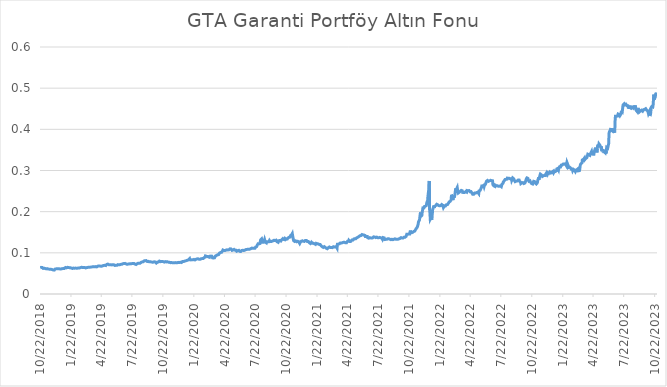
| Category | Fiyat |
|---|---|
| 10/22/18 | 0.064 |
| 10/23/18 | 0.064 |
| 10/24/18 | 0.066 |
| 10/25/18 | 0.065 |
| 10/26/18 | 0.064 |
| 10/27/18 | 0.064 |
| 10/28/18 | 0.064 |
| 10/29/18 | 0.064 |
| 10/30/18 | 0.064 |
| 10/31/18 | 0.062 |
| 11/1/18 | 0.062 |
| 11/2/18 | 0.063 |
| 11/3/18 | 0.063 |
| 11/4/18 | 0.063 |
| 11/5/18 | 0.062 |
| 11/6/18 | 0.062 |
| 11/7/18 | 0.061 |
| 11/8/18 | 0.061 |
| 11/9/18 | 0.061 |
| 11/10/18 | 0.061 |
| 11/11/18 | 0.061 |
| 11/12/18 | 0.062 |
| 11/13/18 | 0.061 |
| 11/14/18 | 0.061 |
| 11/15/18 | 0.06 |
| 11/16/18 | 0.06 |
| 11/17/18 | 0.06 |
| 11/18/18 | 0.06 |
| 11/19/18 | 0.06 |
| 11/20/18 | 0.06 |
| 11/21/18 | 0.06 |
| 11/22/18 | 0.06 |
| 11/23/18 | 0.06 |
| 11/24/18 | 0.06 |
| 11/25/18 | 0.06 |
| 11/26/18 | 0.06 |
| 11/27/18 | 0.059 |
| 11/28/18 | 0.059 |
| 11/29/18 | 0.059 |
| 11/30/18 | 0.058 |
| 12/1/18 | 0.058 |
| 12/2/18 | 0.058 |
| 12/3/18 | 0.058 |
| 12/4/18 | 0.058 |
| 12/5/18 | 0.06 |
| 12/6/18 | 0.061 |
| 12/7/18 | 0.061 |
| 12/8/18 | 0.061 |
| 12/9/18 | 0.061 |
| 12/10/18 | 0.061 |
| 12/11/18 | 0.06 |
| 12/12/18 | 0.061 |
| 12/13/18 | 0.061 |
| 12/14/18 | 0.061 |
| 12/15/18 | 0.061 |
| 12/16/18 | 0.061 |
| 12/17/18 | 0.061 |
| 12/18/18 | 0.061 |
| 12/19/18 | 0.061 |
| 12/20/18 | 0.061 |
| 12/21/18 | 0.061 |
| 12/22/18 | 0.061 |
| 12/23/18 | 0.061 |
| 12/24/18 | 0.061 |
| 12/25/18 | 0.061 |
| 12/26/18 | 0.062 |
| 12/27/18 | 0.062 |
| 12/28/18 | 0.062 |
| 12/29/18 | 0.062 |
| 12/30/18 | 0.062 |
| 12/31/18 | 0.062 |
| 1/1/19 | 0.062 |
| 1/2/19 | 0.062 |
| 1/3/19 | 0.063 |
| 1/4/19 | 0.064 |
| 1/5/19 | 0.064 |
| 1/6/19 | 0.064 |
| 1/7/19 | 0.064 |
| 1/8/19 | 0.064 |
| 1/9/19 | 0.064 |
| 1/10/19 | 0.065 |
| 1/11/19 | 0.065 |
| 1/12/19 | 0.065 |
| 1/13/19 | 0.065 |
| 1/14/19 | 0.064 |
| 1/15/19 | 0.065 |
| 1/16/19 | 0.064 |
| 1/17/19 | 0.064 |
| 1/18/19 | 0.064 |
| 1/19/19 | 0.064 |
| 1/20/19 | 0.064 |
| 1/21/19 | 0.063 |
| 1/22/19 | 0.063 |
| 1/23/19 | 0.063 |
| 1/24/19 | 0.063 |
| 1/25/19 | 0.062 |
| 1/26/19 | 0.062 |
| 1/27/19 | 0.062 |
| 1/28/19 | 0.062 |
| 1/29/19 | 0.063 |
| 1/30/19 | 0.064 |
| 1/31/19 | 0.064 |
| 2/1/19 | 0.063 |
| 2/2/19 | 0.063 |
| 2/3/19 | 0.063 |
| 2/4/19 | 0.063 |
| 2/5/19 | 0.063 |
| 2/6/19 | 0.063 |
| 2/7/19 | 0.063 |
| 2/8/19 | 0.063 |
| 2/9/19 | 0.063 |
| 2/10/19 | 0.063 |
| 2/11/19 | 0.063 |
| 2/12/19 | 0.063 |
| 2/13/19 | 0.063 |
| 2/14/19 | 0.063 |
| 2/15/19 | 0.063 |
| 2/16/19 | 0.063 |
| 2/17/19 | 0.063 |
| 2/18/19 | 0.064 |
| 2/19/19 | 0.064 |
| 2/20/19 | 0.065 |
| 2/21/19 | 0.065 |
| 2/22/19 | 0.065 |
| 2/23/19 | 0.065 |
| 2/24/19 | 0.065 |
| 2/25/19 | 0.064 |
| 2/26/19 | 0.065 |
| 2/27/19 | 0.064 |
| 2/28/19 | 0.064 |
| 3/1/19 | 0.064 |
| 3/2/19 | 0.064 |
| 3/3/19 | 0.064 |
| 3/4/19 | 0.064 |
| 3/5/19 | 0.064 |
| 3/6/19 | 0.063 |
| 3/7/19 | 0.064 |
| 3/8/19 | 0.064 |
| 3/9/19 | 0.064 |
| 3/10/19 | 0.064 |
| 3/11/19 | 0.065 |
| 3/12/19 | 0.065 |
| 3/13/19 | 0.065 |
| 3/14/19 | 0.065 |
| 3/15/19 | 0.065 |
| 3/16/19 | 0.065 |
| 3/17/19 | 0.065 |
| 3/18/19 | 0.065 |
| 3/19/19 | 0.065 |
| 3/20/19 | 0.066 |
| 3/21/19 | 0.065 |
| 3/22/19 | 0.066 |
| 3/23/19 | 0.066 |
| 3/24/19 | 0.066 |
| 3/25/19 | 0.066 |
| 3/26/19 | 0.068 |
| 3/27/19 | 0.066 |
| 3/28/19 | 0.064 |
| 3/29/19 | 0.066 |
| 3/30/19 | 0.066 |
| 3/31/19 | 0.066 |
| 4/1/19 | 0.066 |
| 4/2/19 | 0.066 |
| 4/3/19 | 0.066 |
| 4/4/19 | 0.066 |
| 4/5/19 | 0.066 |
| 4/6/19 | 0.066 |
| 4/7/19 | 0.066 |
| 4/8/19 | 0.066 |
| 4/9/19 | 0.067 |
| 4/10/19 | 0.067 |
| 4/11/19 | 0.068 |
| 4/12/19 | 0.068 |
| 4/13/19 | 0.068 |
| 4/14/19 | 0.068 |
| 4/15/19 | 0.068 |
| 4/16/19 | 0.068 |
| 4/17/19 | 0.068 |
| 4/18/19 | 0.067 |
| 4/19/19 | 0.068 |
| 4/20/19 | 0.068 |
| 4/21/19 | 0.068 |
| 4/22/19 | 0.068 |
| 4/23/19 | 0.068 |
| 4/24/19 | 0.068 |
| 4/25/19 | 0.068 |
| 4/26/19 | 0.069 |
| 4/27/19 | 0.069 |
| 4/28/19 | 0.069 |
| 4/29/19 | 0.069 |
| 4/30/19 | 0.069 |
| 5/1/19 | 0.069 |
| 5/2/19 | 0.07 |
| 5/3/19 | 0.069 |
| 5/4/19 | 0.069 |
| 5/5/19 | 0.069 |
| 5/6/19 | 0.069 |
| 5/7/19 | 0.07 |
| 5/8/19 | 0.072 |
| 5/9/19 | 0.072 |
| 5/10/19 | 0.073 |
| 5/11/19 | 0.073 |
| 5/12/19 | 0.073 |
| 5/13/19 | 0.072 |
| 5/14/19 | 0.071 |
| 5/15/19 | 0.071 |
| 5/16/19 | 0.072 |
| 5/17/19 | 0.071 |
| 5/18/19 | 0.071 |
| 5/19/19 | 0.071 |
| 5/20/19 | 0.071 |
| 5/21/19 | 0.07 |
| 5/22/19 | 0.07 |
| 5/23/19 | 0.071 |
| 5/24/19 | 0.071 |
| 5/25/19 | 0.071 |
| 5/26/19 | 0.071 |
| 5/27/19 | 0.071 |
| 5/28/19 | 0.071 |
| 5/29/19 | 0.071 |
| 5/30/19 | 0.071 |
| 5/31/19 | 0.069 |
| 6/1/19 | 0.069 |
| 6/2/19 | 0.069 |
| 6/3/19 | 0.07 |
| 6/4/19 | 0.07 |
| 6/5/19 | 0.07 |
| 6/6/19 | 0.07 |
| 6/7/19 | 0.07 |
| 6/8/19 | 0.07 |
| 6/9/19 | 0.07 |
| 6/10/19 | 0.071 |
| 6/11/19 | 0.07 |
| 6/12/19 | 0.07 |
| 6/13/19 | 0.071 |
| 6/14/19 | 0.071 |
| 6/15/19 | 0.071 |
| 6/16/19 | 0.071 |
| 6/17/19 | 0.073 |
| 6/18/19 | 0.072 |
| 6/19/19 | 0.072 |
| 6/20/19 | 0.072 |
| 6/21/19 | 0.072 |
| 6/22/19 | 0.072 |
| 6/23/19 | 0.072 |
| 6/24/19 | 0.074 |
| 6/25/19 | 0.074 |
| 6/26/19 | 0.075 |
| 6/27/19 | 0.074 |
| 6/28/19 | 0.074 |
| 6/29/19 | 0.074 |
| 6/30/19 | 0.074 |
| 7/1/19 | 0.074 |
| 7/2/19 | 0.072 |
| 7/3/19 | 0.072 |
| 7/4/19 | 0.073 |
| 7/5/19 | 0.072 |
| 7/6/19 | 0.072 |
| 7/7/19 | 0.072 |
| 7/8/19 | 0.072 |
| 7/9/19 | 0.073 |
| 7/10/19 | 0.073 |
| 7/11/19 | 0.073 |
| 7/12/19 | 0.073 |
| 7/13/19 | 0.073 |
| 7/14/19 | 0.073 |
| 7/15/19 | 0.073 |
| 7/16/19 | 0.073 |
| 7/17/19 | 0.074 |
| 7/18/19 | 0.073 |
| 7/19/19 | 0.074 |
| 7/20/19 | 0.074 |
| 7/21/19 | 0.074 |
| 7/22/19 | 0.074 |
| 7/23/19 | 0.074 |
| 7/24/19 | 0.074 |
| 7/25/19 | 0.074 |
| 7/26/19 | 0.074 |
| 7/27/19 | 0.074 |
| 7/28/19 | 0.074 |
| 7/29/19 | 0.073 |
| 7/30/19 | 0.073 |
| 7/31/19 | 0.072 |
| 8/1/19 | 0.072 |
| 8/2/19 | 0.072 |
| 8/3/19 | 0.072 |
| 8/4/19 | 0.072 |
| 8/5/19 | 0.073 |
| 8/6/19 | 0.074 |
| 8/7/19 | 0.074 |
| 8/8/19 | 0.074 |
| 8/9/19 | 0.075 |
| 8/10/19 | 0.075 |
| 8/11/19 | 0.075 |
| 8/12/19 | 0.075 |
| 8/13/19 | 0.075 |
| 8/14/19 | 0.075 |
| 8/15/19 | 0.075 |
| 8/16/19 | 0.077 |
| 8/17/19 | 0.077 |
| 8/18/19 | 0.077 |
| 8/19/19 | 0.076 |
| 8/20/19 | 0.076 |
| 8/21/19 | 0.078 |
| 8/22/19 | 0.078 |
| 8/23/19 | 0.078 |
| 8/24/19 | 0.078 |
| 8/25/19 | 0.078 |
| 8/26/19 | 0.078 |
| 8/27/19 | 0.08 |
| 8/28/19 | 0.081 |
| 8/29/19 | 0.081 |
| 8/30/19 | 0.081 |
| 8/31/19 | 0.081 |
| 9/1/19 | 0.081 |
| 9/2/19 | 0.081 |
| 9/3/19 | 0.08 |
| 9/4/19 | 0.08 |
| 9/5/19 | 0.079 |
| 9/6/19 | 0.079 |
| 9/7/19 | 0.079 |
| 9/8/19 | 0.079 |
| 9/9/19 | 0.078 |
| 9/10/19 | 0.078 |
| 9/11/19 | 0.078 |
| 9/12/19 | 0.078 |
| 9/13/19 | 0.078 |
| 9/14/19 | 0.078 |
| 9/15/19 | 0.078 |
| 9/16/19 | 0.077 |
| 9/17/19 | 0.078 |
| 9/18/19 | 0.078 |
| 9/19/19 | 0.077 |
| 9/20/19 | 0.077 |
| 9/21/19 | 0.077 |
| 9/22/19 | 0.077 |
| 9/23/19 | 0.077 |
| 9/24/19 | 0.079 |
| 9/25/19 | 0.078 |
| 9/26/19 | 0.078 |
| 9/27/19 | 0.078 |
| 9/28/19 | 0.078 |
| 9/29/19 | 0.078 |
| 9/30/19 | 0.077 |
| 10/1/19 | 0.076 |
| 10/2/19 | 0.075 |
| 10/3/19 | 0.077 |
| 10/4/19 | 0.077 |
| 10/5/19 | 0.077 |
| 10/6/19 | 0.077 |
| 10/7/19 | 0.078 |
| 10/8/19 | 0.078 |
| 10/9/19 | 0.079 |
| 10/10/19 | 0.08 |
| 10/11/19 | 0.08 |
| 10/12/19 | 0.08 |
| 10/13/19 | 0.08 |
| 10/14/19 | 0.078 |
| 10/15/19 | 0.08 |
| 10/16/19 | 0.08 |
| 10/17/19 | 0.079 |
| 10/18/19 | 0.079 |
| 10/19/19 | 0.079 |
| 10/20/19 | 0.079 |
| 10/21/19 | 0.078 |
| 10/22/19 | 0.078 |
| 10/23/19 | 0.078 |
| 10/24/19 | 0.078 |
| 10/25/19 | 0.078 |
| 10/26/19 | 0.078 |
| 10/27/19 | 0.078 |
| 10/28/19 | 0.079 |
| 10/29/19 | 0.079 |
| 10/30/19 | 0.079 |
| 10/31/19 | 0.077 |
| 11/1/19 | 0.078 |
| 11/2/19 | 0.078 |
| 11/3/19 | 0.078 |
| 11/4/19 | 0.078 |
| 11/5/19 | 0.078 |
| 11/6/19 | 0.078 |
| 11/7/19 | 0.077 |
| 11/8/19 | 0.077 |
| 11/9/19 | 0.077 |
| 11/10/19 | 0.077 |
| 11/11/19 | 0.077 |
| 11/12/19 | 0.077 |
| 11/13/19 | 0.076 |
| 11/14/19 | 0.077 |
| 11/15/19 | 0.076 |
| 11/16/19 | 0.076 |
| 11/17/19 | 0.076 |
| 11/18/19 | 0.076 |
| 11/19/19 | 0.076 |
| 11/20/19 | 0.076 |
| 11/21/19 | 0.076 |
| 11/22/19 | 0.076 |
| 11/23/19 | 0.076 |
| 11/24/19 | 0.076 |
| 11/25/19 | 0.076 |
| 11/26/19 | 0.076 |
| 11/27/19 | 0.076 |
| 11/28/19 | 0.076 |
| 11/29/19 | 0.076 |
| 11/30/19 | 0.076 |
| 12/1/19 | 0.076 |
| 12/2/19 | 0.076 |
| 12/3/19 | 0.076 |
| 12/4/19 | 0.076 |
| 12/5/19 | 0.077 |
| 12/6/19 | 0.077 |
| 12/7/19 | 0.077 |
| 12/8/19 | 0.077 |
| 12/9/19 | 0.077 |
| 12/10/19 | 0.076 |
| 12/11/19 | 0.077 |
| 12/12/19 | 0.077 |
| 12/13/19 | 0.077 |
| 12/14/19 | 0.077 |
| 12/15/19 | 0.077 |
| 12/16/19 | 0.076 |
| 12/17/19 | 0.078 |
| 12/18/19 | 0.078 |
| 12/19/19 | 0.079 |
| 12/20/19 | 0.079 |
| 12/21/19 | 0.079 |
| 12/22/19 | 0.079 |
| 12/23/19 | 0.08 |
| 12/24/19 | 0.08 |
| 12/25/19 | 0.08 |
| 12/26/19 | 0.079 |
| 12/27/19 | 0.08 |
| 12/28/19 | 0.08 |
| 12/29/19 | 0.08 |
| 12/30/19 | 0.08 |
| 12/31/19 | 0.081 |
| 1/1/20 | 0.081 |
| 1/2/20 | 0.081 |
| 1/3/20 | 0.082 |
| 1/4/20 | 0.082 |
| 1/5/20 | 0.082 |
| 1/6/20 | 0.083 |
| 1/7/20 | 0.085 |
| 1/8/20 | 0.085 |
| 1/9/20 | 0.086 |
| 1/10/20 | 0.083 |
| 1/11/20 | 0.083 |
| 1/12/20 | 0.083 |
| 1/13/20 | 0.083 |
| 1/14/20 | 0.083 |
| 1/15/20 | 0.083 |
| 1/16/20 | 0.083 |
| 1/17/20 | 0.083 |
| 1/18/20 | 0.083 |
| 1/19/20 | 0.083 |
| 1/20/20 | 0.083 |
| 1/21/20 | 0.083 |
| 1/22/20 | 0.084 |
| 1/23/20 | 0.084 |
| 1/24/20 | 0.083 |
| 1/25/20 | 0.083 |
| 1/26/20 | 0.083 |
| 1/27/20 | 0.084 |
| 1/28/20 | 0.084 |
| 1/29/20 | 0.085 |
| 1/30/20 | 0.084 |
| 1/31/20 | 0.085 |
| 2/1/20 | 0.085 |
| 2/2/20 | 0.085 |
| 2/3/20 | 0.085 |
| 2/4/20 | 0.085 |
| 2/5/20 | 0.085 |
| 2/6/20 | 0.084 |
| 2/7/20 | 0.084 |
| 2/8/20 | 0.084 |
| 2/9/20 | 0.084 |
| 2/10/20 | 0.085 |
| 2/11/20 | 0.085 |
| 2/12/20 | 0.086 |
| 2/13/20 | 0.086 |
| 2/14/20 | 0.086 |
| 2/15/20 | 0.086 |
| 2/16/20 | 0.086 |
| 2/17/20 | 0.086 |
| 2/18/20 | 0.086 |
| 2/19/20 | 0.087 |
| 2/20/20 | 0.088 |
| 2/21/20 | 0.088 |
| 2/22/20 | 0.088 |
| 2/23/20 | 0.088 |
| 2/24/20 | 0.089 |
| 2/25/20 | 0.092 |
| 2/26/20 | 0.091 |
| 2/27/20 | 0.091 |
| 2/28/20 | 0.092 |
| 2/29/20 | 0.092 |
| 3/1/20 | 0.092 |
| 3/2/20 | 0.091 |
| 3/3/20 | 0.09 |
| 3/4/20 | 0.089 |
| 3/5/20 | 0.09 |
| 3/6/20 | 0.089 |
| 3/7/20 | 0.089 |
| 3/8/20 | 0.089 |
| 3/9/20 | 0.092 |
| 3/10/20 | 0.092 |
| 3/11/20 | 0.092 |
| 3/12/20 | 0.092 |
| 3/13/20 | 0.092 |
| 3/14/20 | 0.092 |
| 3/15/20 | 0.092 |
| 3/16/20 | 0.09 |
| 3/17/20 | 0.088 |
| 3/18/20 | 0.087 |
| 3/19/20 | 0.088 |
| 3/20/20 | 0.088 |
| 3/21/20 | 0.088 |
| 3/22/20 | 0.088 |
| 3/23/20 | 0.088 |
| 3/24/20 | 0.089 |
| 3/25/20 | 0.09 |
| 3/26/20 | 0.092 |
| 3/27/20 | 0.094 |
| 3/28/20 | 0.094 |
| 3/29/20 | 0.094 |
| 3/30/20 | 0.094 |
| 3/31/20 | 0.095 |
| 4/1/20 | 0.095 |
| 4/2/20 | 0.096 |
| 4/3/20 | 0.096 |
| 4/4/20 | 0.096 |
| 4/5/20 | 0.096 |
| 4/6/20 | 0.097 |
| 4/7/20 | 0.1 |
| 4/8/20 | 0.1 |
| 4/9/20 | 0.101 |
| 4/10/20 | 0.101 |
| 4/11/20 | 0.101 |
| 4/12/20 | 0.101 |
| 4/13/20 | 0.101 |
| 4/14/20 | 0.103 |
| 4/15/20 | 0.104 |
| 4/16/20 | 0.104 |
| 4/17/20 | 0.107 |
| 4/18/20 | 0.107 |
| 4/19/20 | 0.107 |
| 4/20/20 | 0.105 |
| 4/21/20 | 0.104 |
| 4/22/20 | 0.106 |
| 4/23/20 | 0.106 |
| 4/24/20 | 0.107 |
| 4/25/20 | 0.107 |
| 4/26/20 | 0.107 |
| 4/27/20 | 0.108 |
| 4/28/20 | 0.108 |
| 4/29/20 | 0.107 |
| 4/30/20 | 0.107 |
| 5/1/20 | 0.107 |
| 5/2/20 | 0.107 |
| 5/3/20 | 0.107 |
| 5/4/20 | 0.108 |
| 5/5/20 | 0.108 |
| 5/6/20 | 0.108 |
| 5/7/20 | 0.109 |
| 5/8/20 | 0.11 |
| 5/9/20 | 0.11 |
| 5/10/20 | 0.11 |
| 5/11/20 | 0.11 |
| 5/12/20 | 0.108 |
| 5/13/20 | 0.107 |
| 5/14/20 | 0.106 |
| 5/15/20 | 0.107 |
| 5/16/20 | 0.107 |
| 5/17/20 | 0.107 |
| 5/18/20 | 0.107 |
| 5/19/20 | 0.107 |
| 5/20/20 | 0.108 |
| 5/21/20 | 0.106 |
| 5/22/20 | 0.106 |
| 5/23/20 | 0.106 |
| 5/24/20 | 0.106 |
| 5/25/20 | 0.106 |
| 5/26/20 | 0.106 |
| 5/27/20 | 0.106 |
| 5/28/20 | 0.104 |
| 5/29/20 | 0.105 |
| 5/30/20 | 0.105 |
| 5/31/20 | 0.105 |
| 6/1/20 | 0.106 |
| 6/2/20 | 0.106 |
| 6/3/20 | 0.106 |
| 6/4/20 | 0.104 |
| 6/5/20 | 0.104 |
| 6/6/20 | 0.104 |
| 6/7/20 | 0.104 |
| 6/8/20 | 0.104 |
| 6/9/20 | 0.103 |
| 6/10/20 | 0.104 |
| 6/11/20 | 0.105 |
| 6/12/20 | 0.106 |
| 6/13/20 | 0.106 |
| 6/14/20 | 0.106 |
| 6/15/20 | 0.106 |
| 6/16/20 | 0.105 |
| 6/17/20 | 0.106 |
| 6/18/20 | 0.106 |
| 6/19/20 | 0.106 |
| 6/20/20 | 0.106 |
| 6/21/20 | 0.106 |
| 6/22/20 | 0.106 |
| 6/23/20 | 0.107 |
| 6/24/20 | 0.108 |
| 6/25/20 | 0.109 |
| 6/26/20 | 0.108 |
| 6/27/20 | 0.108 |
| 6/28/20 | 0.108 |
| 6/29/20 | 0.108 |
| 6/30/20 | 0.109 |
| 7/1/20 | 0.109 |
| 7/2/20 | 0.11 |
| 7/3/20 | 0.109 |
| 7/4/20 | 0.109 |
| 7/5/20 | 0.109 |
| 7/6/20 | 0.109 |
| 7/7/20 | 0.109 |
| 7/8/20 | 0.11 |
| 7/9/20 | 0.11 |
| 7/10/20 | 0.112 |
| 7/11/20 | 0.112 |
| 7/12/20 | 0.112 |
| 7/13/20 | 0.111 |
| 7/14/20 | 0.111 |
| 7/15/20 | 0.111 |
| 7/16/20 | 0.111 |
| 7/17/20 | 0.111 |
| 7/18/20 | 0.111 |
| 7/19/20 | 0.111 |
| 7/20/20 | 0.111 |
| 7/21/20 | 0.111 |
| 7/22/20 | 0.112 |
| 7/23/20 | 0.114 |
| 7/24/20 | 0.115 |
| 7/25/20 | 0.115 |
| 7/26/20 | 0.115 |
| 7/27/20 | 0.116 |
| 7/28/20 | 0.119 |
| 7/29/20 | 0.119 |
| 7/30/20 | 0.122 |
| 7/31/20 | 0.122 |
| 8/1/20 | 0.122 |
| 8/2/20 | 0.122 |
| 8/3/20 | 0.122 |
| 8/4/20 | 0.122 |
| 8/5/20 | 0.123 |
| 8/6/20 | 0.127 |
| 8/7/20 | 0.131 |
| 8/8/20 | 0.131 |
| 8/9/20 | 0.131 |
| 8/10/20 | 0.134 |
| 8/11/20 | 0.134 |
| 8/12/20 | 0.134 |
| 8/13/20 | 0.126 |
| 8/14/20 | 0.126 |
| 8/15/20 | 0.126 |
| 8/16/20 | 0.126 |
| 8/17/20 | 0.128 |
| 8/18/20 | 0.128 |
| 8/19/20 | 0.132 |
| 8/20/20 | 0.131 |
| 8/21/20 | 0.126 |
| 8/22/20 | 0.126 |
| 8/23/20 | 0.126 |
| 8/24/20 | 0.124 |
| 8/25/20 | 0.127 |
| 8/26/20 | 0.127 |
| 8/27/20 | 0.125 |
| 8/28/20 | 0.126 |
| 8/29/20 | 0.126 |
| 8/30/20 | 0.126 |
| 8/31/20 | 0.127 |
| 9/1/20 | 0.128 |
| 9/2/20 | 0.13 |
| 9/3/20 | 0.129 |
| 9/4/20 | 0.127 |
| 9/5/20 | 0.127 |
| 9/6/20 | 0.127 |
| 9/7/20 | 0.127 |
| 9/8/20 | 0.128 |
| 9/9/20 | 0.128 |
| 9/10/20 | 0.128 |
| 9/11/20 | 0.129 |
| 9/12/20 | 0.129 |
| 9/13/20 | 0.129 |
| 9/14/20 | 0.129 |
| 9/15/20 | 0.129 |
| 9/16/20 | 0.13 |
| 9/17/20 | 0.131 |
| 9/18/20 | 0.13 |
| 9/19/20 | 0.13 |
| 9/20/20 | 0.13 |
| 9/21/20 | 0.13 |
| 9/22/20 | 0.131 |
| 9/23/20 | 0.129 |
| 9/24/20 | 0.128 |
| 9/25/20 | 0.127 |
| 9/26/20 | 0.127 |
| 9/27/20 | 0.127 |
| 9/28/20 | 0.126 |
| 9/29/20 | 0.128 |
| 9/30/20 | 0.13 |
| 10/1/20 | 0.13 |
| 10/2/20 | 0.13 |
| 10/3/20 | 0.13 |
| 10/4/20 | 0.13 |
| 10/5/20 | 0.129 |
| 10/6/20 | 0.129 |
| 10/7/20 | 0.131 |
| 10/8/20 | 0.13 |
| 10/9/20 | 0.132 |
| 10/10/20 | 0.132 |
| 10/11/20 | 0.132 |
| 10/12/20 | 0.135 |
| 10/13/20 | 0.134 |
| 10/14/20 | 0.134 |
| 10/15/20 | 0.132 |
| 10/16/20 | 0.132 |
| 10/17/20 | 0.132 |
| 10/18/20 | 0.132 |
| 10/19/20 | 0.135 |
| 10/20/20 | 0.134 |
| 10/21/20 | 0.133 |
| 10/22/20 | 0.133 |
| 10/23/20 | 0.134 |
| 10/24/20 | 0.134 |
| 10/25/20 | 0.134 |
| 10/26/20 | 0.135 |
| 10/27/20 | 0.136 |
| 10/28/20 | 0.138 |
| 10/29/20 | 0.138 |
| 10/30/20 | 0.138 |
| 10/31/20 | 0.138 |
| 11/1/20 | 0.138 |
| 11/2/20 | 0.138 |
| 11/3/20 | 0.14 |
| 11/4/20 | 0.142 |
| 11/5/20 | 0.142 |
| 11/6/20 | 0.144 |
| 11/7/20 | 0.144 |
| 11/8/20 | 0.144 |
| 11/9/20 | 0.147 |
| 11/10/20 | 0.142 |
| 11/11/20 | 0.138 |
| 11/12/20 | 0.133 |
| 11/13/20 | 0.13 |
| 11/14/20 | 0.13 |
| 11/15/20 | 0.13 |
| 11/16/20 | 0.128 |
| 11/17/20 | 0.129 |
| 11/18/20 | 0.13 |
| 11/19/20 | 0.129 |
| 11/20/20 | 0.127 |
| 11/21/20 | 0.127 |
| 11/22/20 | 0.127 |
| 11/23/20 | 0.126 |
| 11/24/20 | 0.129 |
| 11/25/20 | 0.128 |
| 11/26/20 | 0.128 |
| 11/27/20 | 0.127 |
| 11/28/20 | 0.127 |
| 11/29/20 | 0.127 |
| 11/30/20 | 0.126 |
| 12/1/20 | 0.123 |
| 12/2/20 | 0.125 |
| 12/3/20 | 0.126 |
| 12/4/20 | 0.128 |
| 12/5/20 | 0.128 |
| 12/6/20 | 0.128 |
| 12/7/20 | 0.128 |
| 12/8/20 | 0.128 |
| 12/9/20 | 0.129 |
| 12/10/20 | 0.129 |
| 12/11/20 | 0.128 |
| 12/12/20 | 0.128 |
| 12/13/20 | 0.128 |
| 12/14/20 | 0.13 |
| 12/15/20 | 0.128 |
| 12/16/20 | 0.129 |
| 12/17/20 | 0.13 |
| 12/18/20 | 0.13 |
| 12/19/20 | 0.13 |
| 12/20/20 | 0.13 |
| 12/21/20 | 0.13 |
| 12/22/20 | 0.13 |
| 12/23/20 | 0.128 |
| 12/24/20 | 0.127 |
| 12/25/20 | 0.127 |
| 12/26/20 | 0.127 |
| 12/27/20 | 0.127 |
| 12/28/20 | 0.126 |
| 12/29/20 | 0.125 |
| 12/30/20 | 0.124 |
| 12/31/20 | 0.123 |
| 1/1/21 | 0.123 |
| 1/2/21 | 0.123 |
| 1/3/21 | 0.123 |
| 1/4/21 | 0.124 |
| 1/5/21 | 0.126 |
| 1/6/21 | 0.127 |
| 1/7/21 | 0.127 |
| 1/8/21 | 0.123 |
| 1/9/21 | 0.123 |
| 1/10/21 | 0.123 |
| 1/11/21 | 0.123 |
| 1/12/21 | 0.122 |
| 1/13/21 | 0.123 |
| 1/14/21 | 0.122 |
| 1/15/21 | 0.121 |
| 1/16/21 | 0.121 |
| 1/17/21 | 0.121 |
| 1/18/21 | 0.121 |
| 1/19/21 | 0.123 |
| 1/20/21 | 0.122 |
| 1/21/21 | 0.122 |
| 1/22/21 | 0.122 |
| 1/23/21 | 0.122 |
| 1/24/21 | 0.122 |
| 1/25/21 | 0.122 |
| 1/26/21 | 0.121 |
| 1/27/21 | 0.121 |
| 1/28/21 | 0.12 |
| 1/29/21 | 0.12 |
| 1/30/21 | 0.12 |
| 1/31/21 | 0.12 |
| 2/1/21 | 0.12 |
| 2/2/21 | 0.119 |
| 2/3/21 | 0.117 |
| 2/4/21 | 0.116 |
| 2/5/21 | 0.115 |
| 2/6/21 | 0.115 |
| 2/7/21 | 0.115 |
| 2/8/21 | 0.113 |
| 2/9/21 | 0.113 |
| 2/10/21 | 0.116 |
| 2/11/21 | 0.115 |
| 2/12/21 | 0.115 |
| 2/13/21 | 0.115 |
| 2/14/21 | 0.115 |
| 2/15/21 | 0.113 |
| 2/16/21 | 0.112 |
| 2/17/21 | 0.112 |
| 2/18/21 | 0.111 |
| 2/19/21 | 0.11 |
| 2/20/21 | 0.11 |
| 2/21/21 | 0.11 |
| 2/22/21 | 0.109 |
| 2/23/21 | 0.11 |
| 2/24/21 | 0.113 |
| 2/25/21 | 0.114 |
| 2/26/21 | 0.114 |
| 2/27/21 | 0.114 |
| 2/28/21 | 0.114 |
| 3/1/21 | 0.116 |
| 3/2/21 | 0.113 |
| 3/3/21 | 0.112 |
| 3/4/21 | 0.112 |
| 3/5/21 | 0.113 |
| 3/6/21 | 0.113 |
| 3/7/21 | 0.113 |
| 3/8/21 | 0.113 |
| 3/9/21 | 0.114 |
| 3/10/21 | 0.115 |
| 3/11/21 | 0.115 |
| 3/12/21 | 0.114 |
| 3/13/21 | 0.114 |
| 3/14/21 | 0.114 |
| 3/15/21 | 0.115 |
| 3/16/21 | 0.115 |
| 3/17/21 | 0.115 |
| 3/18/21 | 0.115 |
| 3/19/21 | 0.114 |
| 3/20/21 | 0.114 |
| 3/21/21 | 0.114 |
| 3/22/21 | 0.111 |
| 3/23/21 | 0.121 |
| 3/24/21 | 0.12 |
| 3/25/21 | 0.122 |
| 3/26/21 | 0.121 |
| 3/27/21 | 0.121 |
| 3/28/21 | 0.121 |
| 3/29/21 | 0.122 |
| 3/30/21 | 0.124 |
| 3/31/21 | 0.124 |
| 4/1/21 | 0.124 |
| 4/2/21 | 0.124 |
| 4/3/21 | 0.124 |
| 4/4/21 | 0.124 |
| 4/5/21 | 0.122 |
| 4/6/21 | 0.124 |
| 4/7/21 | 0.125 |
| 4/8/21 | 0.125 |
| 4/9/21 | 0.126 |
| 4/10/21 | 0.126 |
| 4/11/21 | 0.126 |
| 4/12/21 | 0.125 |
| 4/13/21 | 0.126 |
| 4/14/21 | 0.125 |
| 4/15/21 | 0.124 |
| 4/16/21 | 0.124 |
| 4/17/21 | 0.124 |
| 4/18/21 | 0.124 |
| 4/19/21 | 0.124 |
| 4/20/21 | 0.126 |
| 4/21/21 | 0.126 |
| 4/22/21 | 0.128 |
| 4/23/21 | 0.128 |
| 4/24/21 | 0.128 |
| 4/25/21 | 0.128 |
| 4/26/21 | 0.13 |
| 4/27/21 | 0.13 |
| 4/28/21 | 0.129 |
| 4/29/21 | 0.128 |
| 4/30/21 | 0.128 |
| 5/1/21 | 0.128 |
| 5/2/21 | 0.128 |
| 5/3/21 | 0.128 |
| 5/4/21 | 0.13 |
| 5/5/21 | 0.131 |
| 5/6/21 | 0.131 |
| 5/7/21 | 0.131 |
| 5/8/21 | 0.131 |
| 5/9/21 | 0.131 |
| 5/10/21 | 0.133 |
| 5/11/21 | 0.134 |
| 5/12/21 | 0.134 |
| 5/13/21 | 0.134 |
| 5/14/21 | 0.134 |
| 5/15/21 | 0.134 |
| 5/16/21 | 0.134 |
| 5/17/21 | 0.134 |
| 5/18/21 | 0.136 |
| 5/19/21 | 0.136 |
| 5/20/21 | 0.137 |
| 5/21/21 | 0.138 |
| 5/22/21 | 0.138 |
| 5/23/21 | 0.138 |
| 5/24/21 | 0.138 |
| 5/25/21 | 0.139 |
| 5/26/21 | 0.14 |
| 5/27/21 | 0.142 |
| 5/28/21 | 0.142 |
| 5/29/21 | 0.142 |
| 5/30/21 | 0.142 |
| 5/31/21 | 0.143 |
| 6/1/21 | 0.142 |
| 6/2/21 | 0.144 |
| 6/3/21 | 0.144 |
| 6/4/21 | 0.144 |
| 6/5/21 | 0.144 |
| 6/6/21 | 0.144 |
| 6/7/21 | 0.144 |
| 6/8/21 | 0.144 |
| 6/9/21 | 0.144 |
| 6/10/21 | 0.143 |
| 6/11/21 | 0.142 |
| 6/12/21 | 0.142 |
| 6/13/21 | 0.142 |
| 6/14/21 | 0.14 |
| 6/15/21 | 0.138 |
| 6/16/21 | 0.141 |
| 6/17/21 | 0.14 |
| 6/18/21 | 0.14 |
| 6/19/21 | 0.14 |
| 6/20/21 | 0.14 |
| 6/21/21 | 0.137 |
| 6/22/21 | 0.138 |
| 6/23/21 | 0.137 |
| 6/24/21 | 0.136 |
| 6/25/21 | 0.137 |
| 6/26/21 | 0.137 |
| 6/27/21 | 0.137 |
| 6/28/21 | 0.137 |
| 6/29/21 | 0.137 |
| 6/30/21 | 0.136 |
| 7/1/21 | 0.135 |
| 7/2/21 | 0.136 |
| 7/3/21 | 0.136 |
| 7/4/21 | 0.136 |
| 7/5/21 | 0.137 |
| 7/6/21 | 0.136 |
| 7/7/21 | 0.138 |
| 7/8/21 | 0.138 |
| 7/9/21 | 0.139 |
| 7/10/21 | 0.139 |
| 7/11/21 | 0.139 |
| 7/12/21 | 0.138 |
| 7/13/21 | 0.138 |
| 7/14/21 | 0.137 |
| 7/15/21 | 0.137 |
| 7/16/21 | 0.138 |
| 7/17/21 | 0.138 |
| 7/18/21 | 0.138 |
| 7/19/21 | 0.137 |
| 7/20/21 | 0.137 |
| 7/21/21 | 0.137 |
| 7/22/21 | 0.137 |
| 7/23/21 | 0.137 |
| 7/24/21 | 0.137 |
| 7/25/21 | 0.137 |
| 7/26/21 | 0.137 |
| 7/27/21 | 0.137 |
| 7/28/21 | 0.136 |
| 7/29/21 | 0.136 |
| 7/30/21 | 0.136 |
| 7/31/21 | 0.136 |
| 8/1/21 | 0.136 |
| 8/2/21 | 0.136 |
| 8/3/21 | 0.134 |
| 8/4/21 | 0.133 |
| 8/5/21 | 0.135 |
| 8/6/21 | 0.137 |
| 8/7/21 | 0.137 |
| 8/8/21 | 0.137 |
| 8/9/21 | 0.136 |
| 8/10/21 | 0.134 |
| 8/11/21 | 0.132 |
| 8/12/21 | 0.132 |
| 8/13/21 | 0.133 |
| 8/14/21 | 0.133 |
| 8/15/21 | 0.133 |
| 8/16/21 | 0.132 |
| 8/17/21 | 0.133 |
| 8/18/21 | 0.133 |
| 8/19/21 | 0.134 |
| 8/20/21 | 0.134 |
| 8/21/21 | 0.134 |
| 8/22/21 | 0.134 |
| 8/23/21 | 0.134 |
| 8/24/21 | 0.133 |
| 8/25/21 | 0.134 |
| 8/26/21 | 0.133 |
| 8/27/21 | 0.132 |
| 8/28/21 | 0.132 |
| 8/29/21 | 0.132 |
| 8/30/21 | 0.132 |
| 8/31/21 | 0.133 |
| 9/1/21 | 0.133 |
| 9/2/21 | 0.133 |
| 9/3/21 | 0.132 |
| 9/4/21 | 0.132 |
| 9/5/21 | 0.132 |
| 9/6/21 | 0.133 |
| 9/7/21 | 0.133 |
| 9/8/21 | 0.133 |
| 9/9/21 | 0.133 |
| 9/10/21 | 0.134 |
| 9/11/21 | 0.134 |
| 9/12/21 | 0.134 |
| 9/13/21 | 0.133 |
| 9/14/21 | 0.133 |
| 9/15/21 | 0.133 |
| 9/16/21 | 0.133 |
| 9/17/21 | 0.133 |
| 9/18/21 | 0.133 |
| 9/19/21 | 0.133 |
| 9/20/21 | 0.133 |
| 9/21/21 | 0.134 |
| 9/22/21 | 0.134 |
| 9/23/21 | 0.135 |
| 9/24/21 | 0.135 |
| 9/25/21 | 0.135 |
| 9/26/21 | 0.135 |
| 9/27/21 | 0.137 |
| 9/28/21 | 0.137 |
| 9/29/21 | 0.136 |
| 9/30/21 | 0.135 |
| 10/1/21 | 0.136 |
| 10/2/21 | 0.136 |
| 10/3/21 | 0.136 |
| 10/4/21 | 0.136 |
| 10/5/21 | 0.137 |
| 10/6/21 | 0.137 |
| 10/7/21 | 0.138 |
| 10/8/21 | 0.138 |
| 10/9/21 | 0.138 |
| 10/10/21 | 0.138 |
| 10/11/21 | 0.138 |
| 10/12/21 | 0.139 |
| 10/13/21 | 0.14 |
| 10/14/21 | 0.14 |
| 10/15/21 | 0.145 |
| 10/16/21 | 0.145 |
| 10/17/21 | 0.145 |
| 10/18/21 | 0.145 |
| 10/19/21 | 0.144 |
| 10/20/21 | 0.145 |
| 10/21/21 | 0.146 |
| 10/22/21 | 0.146 |
| 10/23/21 | 0.146 |
| 10/24/21 | 0.146 |
| 10/25/21 | 0.151 |
| 10/26/21 | 0.154 |
| 10/27/21 | 0.15 |
| 10/28/21 | 0.149 |
| 10/29/21 | 0.149 |
| 10/30/21 | 0.149 |
| 10/31/21 | 0.149 |
| 11/1/21 | 0.149 |
| 11/2/21 | 0.15 |
| 11/3/21 | 0.15 |
| 11/4/21 | 0.152 |
| 11/5/21 | 0.152 |
| 11/6/21 | 0.152 |
| 11/7/21 | 0.152 |
| 11/8/21 | 0.153 |
| 11/9/21 | 0.155 |
| 11/10/21 | 0.156 |
| 11/11/21 | 0.157 |
| 11/12/21 | 0.159 |
| 11/13/21 | 0.159 |
| 11/14/21 | 0.159 |
| 11/15/21 | 0.162 |
| 11/16/21 | 0.163 |
| 11/17/21 | 0.167 |
| 11/18/21 | 0.17 |
| 11/19/21 | 0.175 |
| 11/20/21 | 0.175 |
| 11/21/21 | 0.175 |
| 11/22/21 | 0.18 |
| 11/23/21 | 0.182 |
| 11/24/21 | 0.194 |
| 11/25/21 | 0.198 |
| 11/26/21 | 0.189 |
| 11/27/21 | 0.189 |
| 11/28/21 | 0.189 |
| 11/29/21 | 0.191 |
| 11/30/21 | 0.199 |
| 12/1/21 | 0.203 |
| 12/2/21 | 0.209 |
| 12/3/21 | 0.209 |
| 12/4/21 | 0.209 |
| 12/5/21 | 0.209 |
| 12/6/21 | 0.212 |
| 12/7/21 | 0.214 |
| 12/8/21 | 0.213 |
| 12/9/21 | 0.213 |
| 12/10/21 | 0.215 |
| 12/11/21 | 0.215 |
| 12/12/21 | 0.215 |
| 12/13/21 | 0.215 |
| 12/14/21 | 0.223 |
| 12/15/21 | 0.222 |
| 12/16/21 | 0.227 |
| 12/17/21 | 0.237 |
| 12/18/21 | 0.237 |
| 12/19/21 | 0.237 |
| 12/20/21 | 0.258 |
| 12/21/21 | 0.275 |
| 12/22/21 | 0.205 |
| 12/23/21 | 0.196 |
| 12/24/21 | 0.182 |
| 12/25/21 | 0.182 |
| 12/26/21 | 0.182 |
| 12/27/21 | 0.186 |
| 12/28/21 | 0.18 |
| 12/29/21 | 0.188 |
| 12/30/21 | 0.194 |
| 12/31/21 | 0.205 |
| 1/1/22 | 0.205 |
| 1/2/22 | 0.205 |
| 1/3/22 | 0.212 |
| 1/4/22 | 0.215 |
| 1/5/22 | 0.209 |
| 1/6/22 | 0.213 |
| 1/7/22 | 0.215 |
| 1/8/22 | 0.215 |
| 1/9/22 | 0.215 |
| 1/10/22 | 0.216 |
| 1/11/22 | 0.216 |
| 1/12/22 | 0.218 |
| 1/13/22 | 0.219 |
| 1/14/22 | 0.217 |
| 1/15/22 | 0.217 |
| 1/16/22 | 0.217 |
| 1/17/22 | 0.216 |
| 1/18/22 | 0.215 |
| 1/19/22 | 0.214 |
| 1/20/22 | 0.215 |
| 1/21/22 | 0.214 |
| 1/22/22 | 0.214 |
| 1/23/22 | 0.214 |
| 1/24/22 | 0.215 |
| 1/25/22 | 0.215 |
| 1/26/22 | 0.217 |
| 1/27/22 | 0.217 |
| 1/28/22 | 0.215 |
| 1/29/22 | 0.215 |
| 1/30/22 | 0.215 |
| 1/31/22 | 0.214 |
| 2/1/22 | 0.21 |
| 2/2/22 | 0.21 |
| 2/3/22 | 0.212 |
| 2/4/22 | 0.214 |
| 2/5/22 | 0.214 |
| 2/6/22 | 0.214 |
| 2/7/22 | 0.214 |
| 2/8/22 | 0.214 |
| 2/9/22 | 0.216 |
| 2/10/22 | 0.217 |
| 2/11/22 | 0.217 |
| 2/12/22 | 0.217 |
| 2/13/22 | 0.217 |
| 2/14/22 | 0.215 |
| 2/15/22 | 0.218 |
| 2/16/22 | 0.221 |
| 2/17/22 | 0.22 |
| 2/18/22 | 0.224 |
| 2/19/22 | 0.224 |
| 2/20/22 | 0.224 |
| 2/21/22 | 0.225 |
| 2/22/22 | 0.225 |
| 2/23/22 | 0.227 |
| 2/24/22 | 0.229 |
| 2/25/22 | 0.241 |
| 2/26/22 | 0.241 |
| 2/27/22 | 0.241 |
| 2/28/22 | 0.236 |
| 3/1/22 | 0.228 |
| 3/2/22 | 0.232 |
| 3/3/22 | 0.236 |
| 3/4/22 | 0.236 |
| 3/5/22 | 0.236 |
| 3/6/22 | 0.236 |
| 3/7/22 | 0.24 |
| 3/8/22 | 0.247 |
| 3/9/22 | 0.253 |
| 3/10/22 | 0.257 |
| 3/11/22 | 0.253 |
| 3/12/22 | 0.253 |
| 3/13/22 | 0.253 |
| 3/14/22 | 0.259 |
| 3/15/22 | 0.253 |
| 3/16/22 | 0.248 |
| 3/17/22 | 0.245 |
| 3/18/22 | 0.247 |
| 3/19/22 | 0.247 |
| 3/20/22 | 0.247 |
| 3/21/22 | 0.249 |
| 3/22/22 | 0.25 |
| 3/23/22 | 0.25 |
| 3/24/22 | 0.25 |
| 3/25/22 | 0.252 |
| 3/26/22 | 0.252 |
| 3/27/22 | 0.252 |
| 3/28/22 | 0.253 |
| 3/29/22 | 0.251 |
| 3/30/22 | 0.247 |
| 3/31/22 | 0.245 |
| 4/1/22 | 0.246 |
| 4/2/22 | 0.246 |
| 4/3/22 | 0.246 |
| 4/4/22 | 0.246 |
| 4/5/22 | 0.247 |
| 4/6/22 | 0.247 |
| 4/7/22 | 0.247 |
| 4/8/22 | 0.249 |
| 4/9/22 | 0.249 |
| 4/10/22 | 0.249 |
| 4/11/22 | 0.248 |
| 4/12/22 | 0.251 |
| 4/13/22 | 0.25 |
| 4/14/22 | 0.25 |
| 4/15/22 | 0.251 |
| 4/16/22 | 0.251 |
| 4/17/22 | 0.251 |
| 4/18/22 | 0.251 |
| 4/19/22 | 0.254 |
| 4/20/22 | 0.252 |
| 4/21/22 | 0.248 |
| 4/22/22 | 0.249 |
| 4/23/22 | 0.249 |
| 4/24/22 | 0.249 |
| 4/25/22 | 0.249 |
| 4/26/22 | 0.247 |
| 4/27/22 | 0.245 |
| 4/28/22 | 0.245 |
| 4/29/22 | 0.242 |
| 4/30/22 | 0.242 |
| 5/1/22 | 0.242 |
| 5/2/22 | 0.242 |
| 5/3/22 | 0.242 |
| 5/4/22 | 0.242 |
| 5/5/22 | 0.245 |
| 5/6/22 | 0.245 |
| 5/7/22 | 0.245 |
| 5/8/22 | 0.245 |
| 5/9/22 | 0.244 |
| 5/10/22 | 0.243 |
| 5/11/22 | 0.246 |
| 5/12/22 | 0.247 |
| 5/13/22 | 0.247 |
| 5/14/22 | 0.247 |
| 5/15/22 | 0.247 |
| 5/16/22 | 0.245 |
| 5/17/22 | 0.244 |
| 5/18/22 | 0.251 |
| 5/19/22 | 0.251 |
| 5/20/22 | 0.252 |
| 5/21/22 | 0.252 |
| 5/22/22 | 0.252 |
| 5/23/22 | 0.255 |
| 5/24/22 | 0.256 |
| 5/25/22 | 0.259 |
| 5/26/22 | 0.262 |
| 5/27/22 | 0.263 |
| 5/28/22 | 0.263 |
| 5/29/22 | 0.263 |
| 5/30/22 | 0.264 |
| 5/31/22 | 0.264 |
| 6/1/22 | 0.264 |
| 6/2/22 | 0.261 |
| 6/3/22 | 0.264 |
| 6/4/22 | 0.264 |
| 6/5/22 | 0.264 |
| 6/6/22 | 0.267 |
| 6/7/22 | 0.266 |
| 6/8/22 | 0.269 |
| 6/9/22 | 0.274 |
| 6/10/22 | 0.276 |
| 6/11/22 | 0.276 |
| 6/12/22 | 0.276 |
| 6/13/22 | 0.274 |
| 6/14/22 | 0.276 |
| 6/15/22 | 0.274 |
| 6/16/22 | 0.272 |
| 6/17/22 | 0.275 |
| 6/18/22 | 0.275 |
| 6/19/22 | 0.275 |
| 6/20/22 | 0.276 |
| 6/21/22 | 0.276 |
| 6/22/22 | 0.276 |
| 6/23/22 | 0.275 |
| 6/24/22 | 0.275 |
| 6/25/22 | 0.275 |
| 6/26/22 | 0.275 |
| 6/27/22 | 0.275 |
| 6/28/22 | 0.266 |
| 6/29/22 | 0.264 |
| 6/30/22 | 0.263 |
| 7/1/22 | 0.263 |
| 7/2/22 | 0.263 |
| 7/3/22 | 0.263 |
| 7/4/22 | 0.261 |
| 7/5/22 | 0.264 |
| 7/6/22 | 0.267 |
| 7/7/22 | 0.264 |
| 7/8/22 | 0.263 |
| 7/9/22 | 0.263 |
| 7/10/22 | 0.263 |
| 7/11/22 | 0.263 |
| 7/12/22 | 0.263 |
| 7/13/22 | 0.263 |
| 7/14/22 | 0.262 |
| 7/15/22 | 0.262 |
| 7/16/22 | 0.262 |
| 7/17/22 | 0.262 |
| 7/18/22 | 0.262 |
| 7/19/22 | 0.262 |
| 7/20/22 | 0.263 |
| 7/21/22 | 0.263 |
| 7/22/22 | 0.261 |
| 7/23/22 | 0.261 |
| 7/24/22 | 0.261 |
| 7/25/22 | 0.267 |
| 7/26/22 | 0.269 |
| 7/27/22 | 0.268 |
| 7/28/22 | 0.269 |
| 7/29/22 | 0.272 |
| 7/30/22 | 0.272 |
| 7/31/22 | 0.272 |
| 8/1/22 | 0.275 |
| 8/2/22 | 0.276 |
| 8/3/22 | 0.278 |
| 8/4/22 | 0.278 |
| 8/5/22 | 0.279 |
| 8/6/22 | 0.279 |
| 8/7/22 | 0.279 |
| 8/8/22 | 0.28 |
| 8/9/22 | 0.279 |
| 8/10/22 | 0.282 |
| 8/11/22 | 0.281 |
| 8/12/22 | 0.281 |
| 8/13/22 | 0.281 |
| 8/14/22 | 0.281 |
| 8/15/22 | 0.281 |
| 8/16/22 | 0.281 |
| 8/17/22 | 0.28 |
| 8/18/22 | 0.28 |
| 8/19/22 | 0.28 |
| 8/20/22 | 0.28 |
| 8/21/22 | 0.28 |
| 8/22/22 | 0.28 |
| 8/23/22 | 0.276 |
| 8/24/22 | 0.277 |
| 8/25/22 | 0.279 |
| 8/26/22 | 0.282 |
| 8/27/22 | 0.282 |
| 8/28/22 | 0.282 |
| 8/29/22 | 0.28 |
| 8/30/22 | 0.28 |
| 8/31/22 | 0.276 |
| 9/1/22 | 0.274 |
| 9/2/22 | 0.273 |
| 9/3/22 | 0.273 |
| 9/4/22 | 0.273 |
| 9/5/22 | 0.274 |
| 9/6/22 | 0.274 |
| 9/7/22 | 0.275 |
| 9/8/22 | 0.274 |
| 9/9/22 | 0.277 |
| 9/10/22 | 0.277 |
| 9/11/22 | 0.277 |
| 9/12/22 | 0.277 |
| 9/13/22 | 0.276 |
| 9/14/22 | 0.277 |
| 9/15/22 | 0.274 |
| 9/16/22 | 0.272 |
| 9/17/22 | 0.272 |
| 9/18/22 | 0.272 |
| 9/19/22 | 0.268 |
| 9/20/22 | 0.269 |
| 9/21/22 | 0.269 |
| 9/22/22 | 0.27 |
| 9/23/22 | 0.271 |
| 9/24/22 | 0.271 |
| 9/25/22 | 0.271 |
| 9/26/22 | 0.271 |
| 9/27/22 | 0.268 |
| 9/28/22 | 0.268 |
| 9/29/22 | 0.266 |
| 9/30/22 | 0.27 |
| 10/1/22 | 0.27 |
| 10/2/22 | 0.27 |
| 10/3/22 | 0.273 |
| 10/4/22 | 0.273 |
| 10/5/22 | 0.279 |
| 10/6/22 | 0.281 |
| 10/7/22 | 0.282 |
| 10/8/22 | 0.282 |
| 10/9/22 | 0.282 |
| 10/10/22 | 0.281 |
| 10/11/22 | 0.276 |
| 10/12/22 | 0.275 |
| 10/13/22 | 0.274 |
| 10/14/22 | 0.275 |
| 10/15/22 | 0.275 |
| 10/16/22 | 0.275 |
| 10/17/22 | 0.273 |
| 10/18/22 | 0.272 |
| 10/19/22 | 0.271 |
| 10/20/22 | 0.271 |
| 10/21/22 | 0.268 |
| 10/22/22 | 0.268 |
| 10/23/22 | 0.268 |
| 10/24/22 | 0.267 |
| 10/25/22 | 0.27 |
| 10/26/22 | 0.27 |
| 10/27/22 | 0.274 |
| 10/28/22 | 0.273 |
| 10/29/22 | 0.273 |
| 10/30/22 | 0.273 |
| 10/31/22 | 0.273 |
| 11/1/22 | 0.27 |
| 11/2/22 | 0.271 |
| 11/3/22 | 0.271 |
| 11/4/22 | 0.267 |
| 11/5/22 | 0.267 |
| 11/6/22 | 0.267 |
| 11/7/22 | 0.27 |
| 11/8/22 | 0.275 |
| 11/9/22 | 0.274 |
| 11/10/22 | 0.28 |
| 11/11/22 | 0.28 |
| 11/12/22 | 0.28 |
| 11/13/22 | 0.28 |
| 11/14/22 | 0.286 |
| 11/15/22 | 0.288 |
| 11/16/22 | 0.291 |
| 11/17/22 | 0.292 |
| 11/18/22 | 0.29 |
| 11/19/22 | 0.29 |
| 11/20/22 | 0.29 |
| 11/21/22 | 0.288 |
| 11/22/22 | 0.286 |
| 11/23/22 | 0.286 |
| 11/24/22 | 0.286 |
| 11/25/22 | 0.287 |
| 11/26/22 | 0.287 |
| 11/27/22 | 0.287 |
| 11/28/22 | 0.288 |
| 11/29/22 | 0.288 |
| 11/30/22 | 0.288 |
| 12/1/22 | 0.288 |
| 12/2/22 | 0.291 |
| 12/3/22 | 0.291 |
| 12/4/22 | 0.291 |
| 12/5/22 | 0.295 |
| 12/6/22 | 0.295 |
| 12/7/22 | 0.292 |
| 12/8/22 | 0.294 |
| 12/9/22 | 0.293 |
| 12/10/22 | 0.293 |
| 12/11/22 | 0.293 |
| 12/12/22 | 0.294 |
| 12/13/22 | 0.295 |
| 12/14/22 | 0.296 |
| 12/15/22 | 0.296 |
| 12/16/22 | 0.294 |
| 12/17/22 | 0.294 |
| 12/18/22 | 0.294 |
| 12/19/22 | 0.292 |
| 12/20/22 | 0.294 |
| 12/21/22 | 0.296 |
| 12/22/22 | 0.297 |
| 12/23/22 | 0.299 |
| 12/24/22 | 0.299 |
| 12/25/22 | 0.299 |
| 12/26/22 | 0.295 |
| 12/27/22 | 0.296 |
| 12/28/22 | 0.298 |
| 12/29/22 | 0.298 |
| 12/30/22 | 0.298 |
| 12/31/22 | 0.298 |
| 1/1/23 | 0.298 |
| 1/2/23 | 0.3 |
| 1/3/23 | 0.3 |
| 1/4/23 | 0.304 |
| 1/5/23 | 0.306 |
| 1/6/23 | 0.305 |
| 1/7/23 | 0.305 |
| 1/8/23 | 0.305 |
| 1/9/23 | 0.302 |
| 1/10/23 | 0.306 |
| 1/11/23 | 0.308 |
| 1/12/23 | 0.309 |
| 1/13/23 | 0.309 |
| 1/14/23 | 0.309 |
| 1/15/23 | 0.309 |
| 1/16/23 | 0.311 |
| 1/17/23 | 0.313 |
| 1/18/23 | 0.313 |
| 1/19/23 | 0.314 |
| 1/20/23 | 0.313 |
| 1/21/23 | 0.313 |
| 1/22/23 | 0.313 |
| 1/23/23 | 0.316 |
| 1/24/23 | 0.316 |
| 1/25/23 | 0.315 |
| 1/26/23 | 0.316 |
| 1/27/23 | 0.316 |
| 1/28/23 | 0.316 |
| 1/29/23 | 0.316 |
| 1/30/23 | 0.315 |
| 1/31/23 | 0.315 |
| 2/1/23 | 0.312 |
| 2/2/23 | 0.315 |
| 2/3/23 | 0.32 |
| 2/4/23 | 0.32 |
| 2/5/23 | 0.32 |
| 2/6/23 | 0.313 |
| 2/7/23 | 0.307 |
| 2/8/23 | 0.307 |
| 2/9/23 | 0.309 |
| 2/10/23 | 0.309 |
| 2/11/23 | 0.309 |
| 2/12/23 | 0.309 |
| 2/13/23 | 0.307 |
| 2/14/23 | 0.305 |
| 2/15/23 | 0.305 |
| 2/16/23 | 0.303 |
| 2/17/23 | 0.303 |
| 2/18/23 | 0.303 |
| 2/19/23 | 0.303 |
| 2/20/23 | 0.3 |
| 2/21/23 | 0.301 |
| 2/22/23 | 0.303 |
| 2/23/23 | 0.303 |
| 2/24/23 | 0.301 |
| 2/25/23 | 0.301 |
| 2/26/23 | 0.301 |
| 2/27/23 | 0.301 |
| 2/28/23 | 0.297 |
| 3/1/23 | 0.298 |
| 3/2/23 | 0.301 |
| 3/3/23 | 0.302 |
| 3/4/23 | 0.302 |
| 3/5/23 | 0.302 |
| 3/6/23 | 0.304 |
| 3/7/23 | 0.304 |
| 3/8/23 | 0.304 |
| 3/9/23 | 0.299 |
| 3/10/23 | 0.3 |
| 3/11/23 | 0.3 |
| 3/12/23 | 0.3 |
| 3/13/23 | 0.303 |
| 3/14/23 | 0.31 |
| 3/15/23 | 0.314 |
| 3/16/23 | 0.315 |
| 3/17/23 | 0.317 |
| 3/18/23 | 0.317 |
| 3/19/23 | 0.317 |
| 3/20/23 | 0.319 |
| 3/21/23 | 0.329 |
| 3/22/23 | 0.326 |
| 3/23/23 | 0.322 |
| 3/24/23 | 0.327 |
| 3/25/23 | 0.327 |
| 3/26/23 | 0.327 |
| 3/27/23 | 0.33 |
| 3/28/23 | 0.326 |
| 3/29/23 | 0.325 |
| 3/30/23 | 0.328 |
| 3/31/23 | 0.33 |
| 4/1/23 | 0.33 |
| 4/2/23 | 0.33 |
| 4/3/23 | 0.331 |
| 4/4/23 | 0.329 |
| 4/5/23 | 0.332 |
| 4/6/23 | 0.34 |
| 4/7/23 | 0.338 |
| 4/8/23 | 0.338 |
| 4/9/23 | 0.338 |
| 4/10/23 | 0.338 |
| 4/11/23 | 0.338 |
| 4/12/23 | 0.337 |
| 4/13/23 | 0.338 |
| 4/14/23 | 0.341 |
| 4/15/23 | 0.341 |
| 4/16/23 | 0.341 |
| 4/17/23 | 0.346 |
| 4/18/23 | 0.341 |
| 4/19/23 | 0.34 |
| 4/20/23 | 0.34 |
| 4/21/23 | 0.34 |
| 4/22/23 | 0.34 |
| 4/23/23 | 0.34 |
| 4/24/23 | 0.339 |
| 4/25/23 | 0.344 |
| 4/26/23 | 0.348 |
| 4/27/23 | 0.349 |
| 4/28/23 | 0.353 |
| 4/29/23 | 0.353 |
| 4/30/23 | 0.353 |
| 5/1/23 | 0.353 |
| 5/2/23 | 0.352 |
| 5/3/23 | 0.344 |
| 5/4/23 | 0.352 |
| 5/5/23 | 0.36 |
| 5/6/23 | 0.36 |
| 5/7/23 | 0.36 |
| 5/8/23 | 0.36 |
| 5/9/23 | 0.365 |
| 5/10/23 | 0.366 |
| 5/11/23 | 0.365 |
| 5/12/23 | 0.361 |
| 5/13/23 | 0.361 |
| 5/14/23 | 0.361 |
| 5/15/23 | 0.355 |
| 5/16/23 | 0.358 |
| 5/17/23 | 0.35 |
| 5/18/23 | 0.349 |
| 5/19/23 | 0.349 |
| 5/20/23 | 0.349 |
| 5/21/23 | 0.349 |
| 5/22/23 | 0.349 |
| 5/23/23 | 0.348 |
| 5/24/23 | 0.342 |
| 5/25/23 | 0.345 |
| 5/26/23 | 0.343 |
| 5/27/23 | 0.343 |
| 5/28/23 | 0.343 |
| 5/29/23 | 0.346 |
| 5/30/23 | 0.342 |
| 5/31/23 | 0.349 |
| 6/1/23 | 0.356 |
| 6/2/23 | 0.354 |
| 6/3/23 | 0.354 |
| 6/4/23 | 0.354 |
| 6/5/23 | 0.358 |
| 6/6/23 | 0.359 |
| 6/7/23 | 0.366 |
| 6/8/23 | 0.39 |
| 6/9/23 | 0.394 |
| 6/10/23 | 0.394 |
| 6/11/23 | 0.394 |
| 6/12/23 | 0.399 |
| 6/13/23 | 0.4 |
| 6/14/23 | 0.403 |
| 6/15/23 | 0.397 |
| 6/16/23 | 0.396 |
| 6/17/23 | 0.396 |
| 6/18/23 | 0.396 |
| 6/19/23 | 0.402 |
| 6/20/23 | 0.399 |
| 6/21/23 | 0.399 |
| 6/22/23 | 0.394 |
| 6/23/23 | 0.395 |
| 6/24/23 | 0.395 |
| 6/25/23 | 0.395 |
| 6/26/23 | 0.42 |
| 6/27/23 | 0.432 |
| 6/28/23 | 0.432 |
| 6/29/23 | 0.432 |
| 6/30/23 | 0.432 |
| 7/1/23 | 0.432 |
| 7/2/23 | 0.432 |
| 7/3/23 | 0.432 |
| 7/4/23 | 0.434 |
| 7/5/23 | 0.437 |
| 7/6/23 | 0.437 |
| 7/7/23 | 0.436 |
| 7/8/23 | 0.436 |
| 7/9/23 | 0.436 |
| 7/10/23 | 0.433 |
| 7/11/23 | 0.435 |
| 7/12/23 | 0.435 |
| 7/13/23 | 0.436 |
| 7/14/23 | 0.441 |
| 7/15/23 | 0.441 |
| 7/16/23 | 0.441 |
| 7/17/23 | 0.44 |
| 7/18/23 | 0.443 |
| 7/19/23 | 0.455 |
| 7/20/23 | 0.46 |
| 7/21/23 | 0.462 |
| 7/22/23 | 0.462 |
| 7/23/23 | 0.462 |
| 7/24/23 | 0.46 |
| 7/25/23 | 0.46 |
| 7/26/23 | 0.457 |
| 7/27/23 | 0.46 |
| 7/28/23 | 0.461 |
| 7/29/23 | 0.461 |
| 7/30/23 | 0.461 |
| 7/31/23 | 0.458 |
| 8/1/23 | 0.457 |
| 8/2/23 | 0.457 |
| 8/3/23 | 0.457 |
| 8/4/23 | 0.453 |
| 8/5/23 | 0.453 |
| 8/6/23 | 0.453 |
| 8/7/23 | 0.453 |
| 8/8/23 | 0.453 |
| 8/9/23 | 0.458 |
| 8/10/23 | 0.453 |
| 8/11/23 | 0.451 |
| 8/12/23 | 0.451 |
| 8/13/23 | 0.451 |
| 8/14/23 | 0.449 |
| 8/15/23 | 0.452 |
| 8/16/23 | 0.453 |
| 8/17/23 | 0.452 |
| 8/18/23 | 0.452 |
| 8/19/23 | 0.452 |
| 8/20/23 | 0.452 |
| 8/21/23 | 0.45 |
| 8/22/23 | 0.458 |
| 8/23/23 | 0.452 |
| 8/24/23 | 0.454 |
| 8/25/23 | 0.458 |
| 8/26/23 | 0.458 |
| 8/27/23 | 0.458 |
| 8/28/23 | 0.446 |
| 8/29/23 | 0.444 |
| 8/30/23 | 0.444 |
| 8/31/23 | 0.443 |
| 9/1/23 | 0.448 |
| 9/2/23 | 0.448 |
| 9/3/23 | 0.448 |
| 9/4/23 | 0.449 |
| 9/5/23 | 0.446 |
| 9/6/23 | 0.446 |
| 9/7/23 | 0.443 |
| 9/8/23 | 0.445 |
| 9/9/23 | 0.445 |
| 9/10/23 | 0.445 |
| 9/11/23 | 0.447 |
| 9/12/23 | 0.446 |
| 9/13/23 | 0.446 |
| 9/14/23 | 0.448 |
| 9/15/23 | 0.444 |
| 9/16/23 | 0.444 |
| 9/17/23 | 0.444 |
| 9/18/23 | 0.446 |
| 9/19/23 | 0.448 |
| 9/20/23 | 0.45 |
| 9/21/23 | 0.45 |
| 9/22/23 | 0.449 |
| 9/23/23 | 0.449 |
| 9/24/23 | 0.449 |
| 9/25/23 | 0.45 |
| 9/26/23 | 0.45 |
| 9/27/23 | 0.451 |
| 9/28/23 | 0.446 |
| 9/29/23 | 0.445 |
| 9/30/23 | 0.445 |
| 10/1/23 | 0.445 |
| 10/2/23 | 0.442 |
| 10/3/23 | 0.438 |
| 10/4/23 | 0.436 |
| 10/5/23 | 0.442 |
| 10/6/23 | 0.436 |
| 10/7/23 | 0.436 |
| 10/8/23 | 0.436 |
| 10/9/23 | 0.436 |
| 10/10/23 | 0.441 |
| 10/11/23 | 0.453 |
| 10/12/23 | 0.451 |
| 10/13/23 | 0.455 |
| 10/14/23 | 0.455 |
| 10/15/23 | 0.455 |
| 10/16/23 | 0.454 |
| 10/17/23 | 0.459 |
| 10/18/23 | 0.461 |
| 10/19/23 | 0.484 |
| 10/20/23 | 0.473 |
| 10/21/23 | 0.473 |
| 10/22/23 | 0.473 |
| 10/23/23 | 0.478 |
| 10/24/23 | 0.48 |
| 10/25/23 | 0.48 |
| 10/26/23 | 0.489 |
| 10/27/23 | 0.482 |
| 10/28/23 | 0.482 |